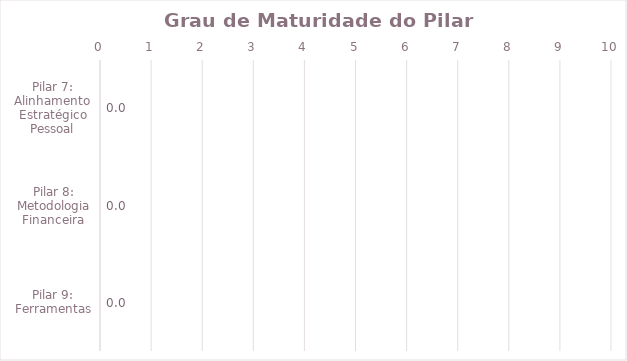
| Category | Series 0 |
|---|---|
| Pilar 7: Alinhamento Estratégico Pessoal | 0 |
| Pilar 8: Metodologia Financeira | 0 |
| Pilar 9: Ferramentas | 0 |